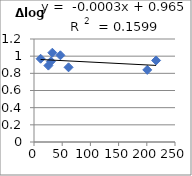
| Category | Δlog K |
|---|---|
| 25.5 | 0.89 |
| 61.3 | 0.87 |
| 11.7 | 0.97 |
| 216.5 | 0.95 |
| 46.8 | 1.01 |
| 32.5 | 1.04 |
| 200.8 | 0.84 |
| 30.1 | 0.94 |